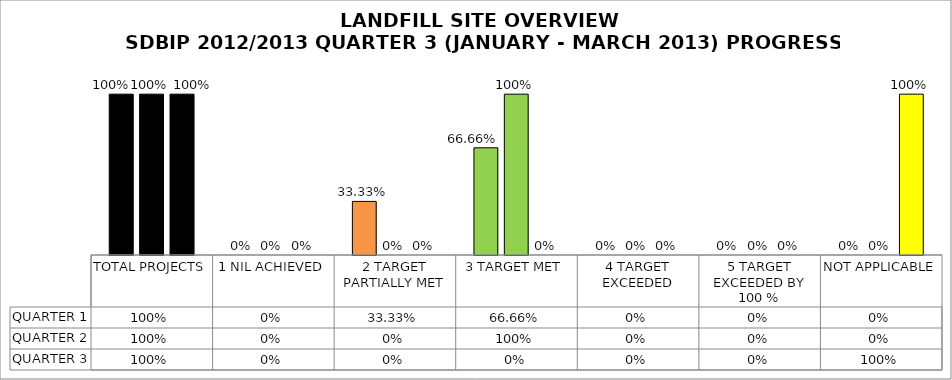
| Category | QUARTER 1 | QUARTER 2 | QUARTER 3 |
|---|---|---|---|
| TOTAL PROJECTS | 1 | 1 | 1 |
| 1 NIL ACHIEVED | 0 | 0 | 0 |
| 2 TARGET PARTIALLY MET | 0.333 | 0 | 0 |
| 3 TARGET MET | 0.667 | 1 | 0 |
| 4 TARGET EXCEEDED | 0 | 0 | 0 |
| 5 TARGET EXCEEDED BY 100 % | 0 | 0 | 0 |
| NOT APPLICABLE | 0 | 0 | 1 |